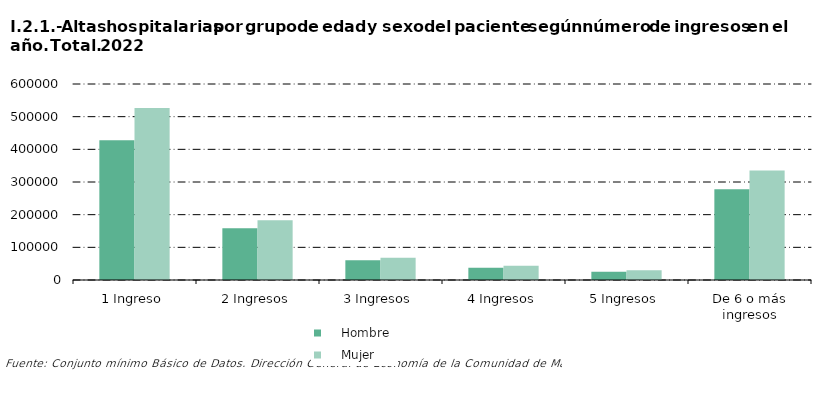
| Category |     Hombre |     Mujer |
|---|---|---|
| 1 Ingreso | 427777 | 526353 |
| 2 Ingresos | 158311 | 183213 |
| 3 Ingresos | 60503 | 67907 |
| 4 Ingresos | 37467 | 43471 |
| 5 Ingresos | 25141 | 29644 |
| De 6 o más ingresos | 277544 | 335258 |